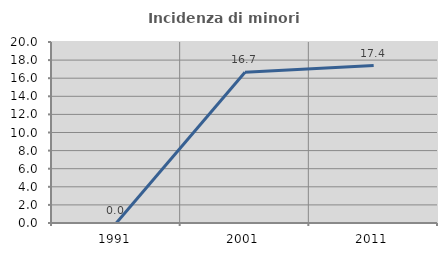
| Category | Incidenza di minori stranieri |
|---|---|
| 1991.0 | 0 |
| 2001.0 | 16.667 |
| 2011.0 | 17.391 |